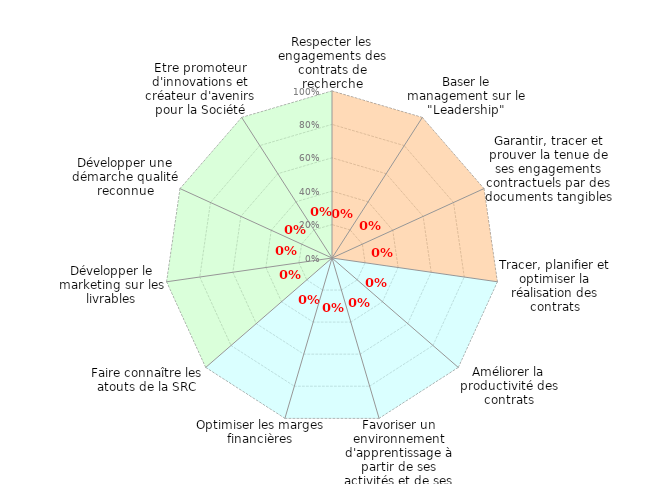
| Category | Efficacite | Efficience | Qualite | Moyenne |
|---|---|---|---|---|
| 0 | 1 | 0 | 1 | 0 |
| 1 | 1 | 0 | 0 | 0 |
| 2 | 1 | 0 | 0 | 0 |
| 3 | 1 | 1 | 0 | 0 |
| 4 | 0 | 1 | 0 | 0 |
| 5 | 0 | 1 | 0 | 0 |
| 6 | 0 | 1 | 0 | 0 |
| 7 | 0 | 1 | 1 | 0 |
| 8 | 0 | 0 | 1 | 0 |
| 9 | 0 | 0 | 1 | 0 |
| 10 | 0 | 0 | 1 | 0 |